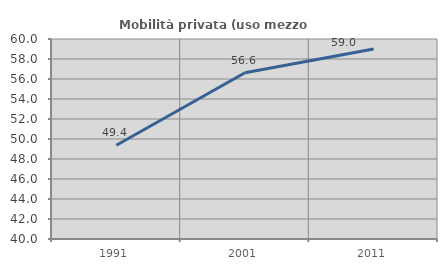
| Category | Mobilità privata (uso mezzo privato) |
|---|---|
| 1991.0 | 49.378 |
| 2001.0 | 56.627 |
| 2011.0 | 58.991 |